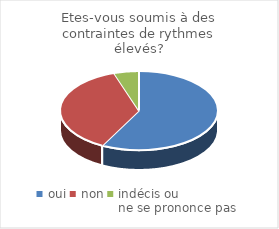
| Category | Etes-vous soumis à des contraintes de rythmes élevés? |
|---|---|
| oui | 45 |
| non | 29 |
| indécis ou 
ne se prononce pas | 4 |